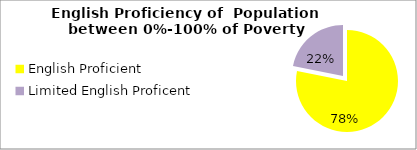
| Category | Percent |
|---|---|
| English Proficient | 0.782 |
| Limited English Proficent | 0.218 |